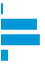
| Category | Series 0 |
|---|---|
| 0 | 0.013 |
| 1 | 0.437 |
| 2 | 0.473 |
| 3 | 0.076 |